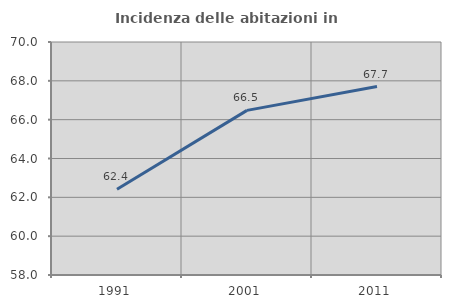
| Category | Incidenza delle abitazioni in proprietà  |
|---|---|
| 1991.0 | 62.417 |
| 2001.0 | 66.479 |
| 2011.0 | 67.704 |